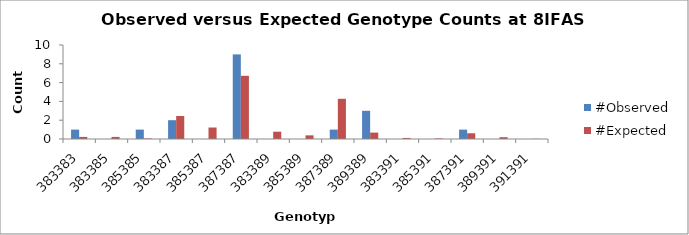
| Category | #Observed | #Expected |
|---|---|---|
| 383383.0 | 1 | 0.222 |
| 383385.0 | 0 | 0.222 |
| 385385.0 | 1 | 0.056 |
| 383387.0 | 2 | 2.444 |
| 385387.0 | 0 | 1.222 |
| 387387.0 | 9 | 6.722 |
| 383389.0 | 0 | 0.778 |
| 385389.0 | 0 | 0.389 |
| 387389.0 | 1 | 4.278 |
| 389389.0 | 3 | 0.681 |
| 383391.0 | 0 | 0.111 |
| 385391.0 | 0 | 0.056 |
| 387391.0 | 1 | 0.611 |
| 389391.0 | 0 | 0.194 |
| 391391.0 | 0 | 0.014 |